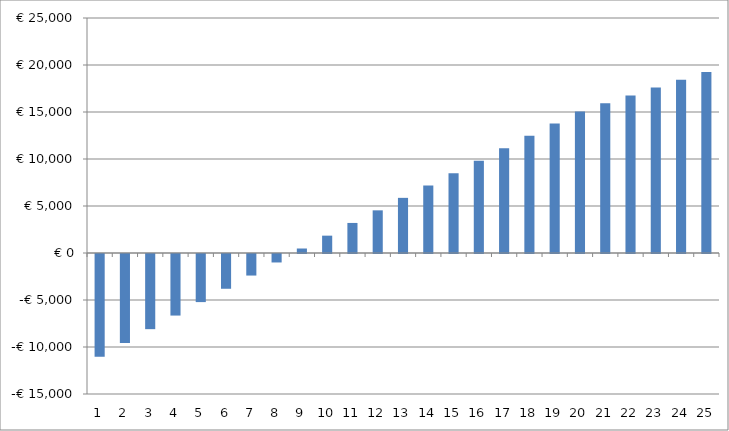
| Category | Series 0 |
|---|---|
| 0 | -10928.9 |
| 1 | -9455.297 |
| 2 | -7995.564 |
| 3 | -6549.578 |
| 4 | -5117.214 |
| 5 | -3698.35 |
| 6 | -2292.863 |
| 7 | -900.635 |
| 8 | 478.455 |
| 9 | 1844.525 |
| 10 | 3197.692 |
| 11 | 4538.072 |
| 12 | 5865.78 |
| 13 | 7180.93 |
| 14 | 8483.636 |
| 15 | 9824.008 |
| 16 | 11152.159 |
| 17 | 12468.199 |
| 18 | 13772.235 |
| 19 | 15064.377 |
| 20 | 15920.242 |
| 21 | 16767.347 |
| 22 | 17605.769 |
| 23 | 18435.587 |
| 24 | 19256.878 |